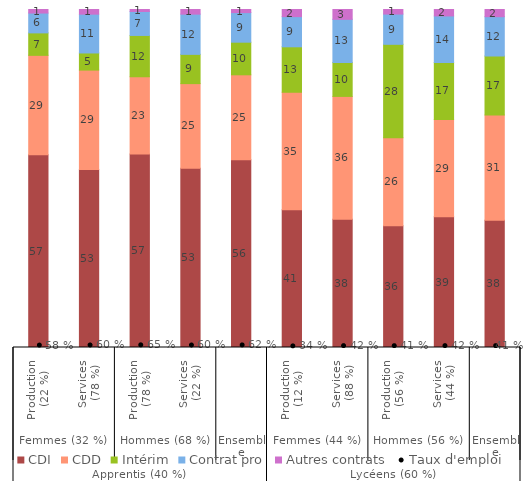
| Category | CDI | CDD | Intérim | Contrat pro | Autres contrats |
|---|---|---|---|---|---|
| 0 | 57.023 | 29.41 | 6.647 | 5.873 | 1.047 |
| 1 | 52.628 | 29.443 | 5.065 | 11.485 | 1.378 |
| 2 | 57.262 | 22.809 | 12.253 | 7.092 | 0.584 |
| 3 | 53.003 | 25.067 | 8.66 | 11.898 | 1.373 |
| 4 | 55.526 | 25.151 | 9.652 | 8.755 | 0.917 |
| 5 | 40.734 | 34.769 | 13.461 | 8.931 | 2.105 |
| 6 | 37.916 | 36.369 | 10.059 | 12.747 | 2.909 |
| 7 | 35.997 | 26.068 | 27.635 | 8.947 | 1.353 |
| 8 | 38.669 | 28.82 | 16.838 | 13.767 | 1.905 |
| 9 | 37.629 | 31.129 | 17.482 | 11.634 | 2.126 |